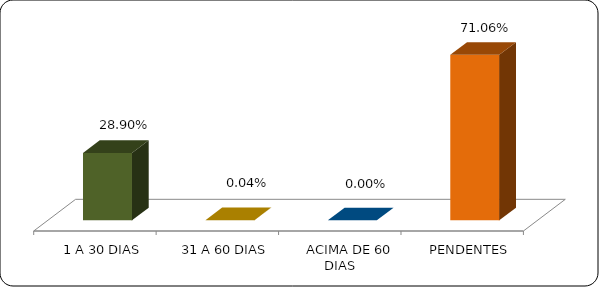
| Category | Series 0 |
|---|---|
|      1 A 30 DIAS | 0.289 |
|      31 A 60 DIAS | 0 |
|      ACIMA DE 60 DIAS | 0 |
|      PENDENTES | 0.711 |